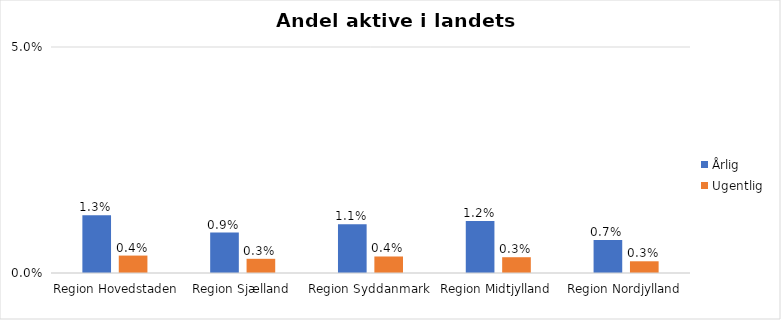
| Category | Årlig | Ugentlig |
|---|---|---|
| Region Hovedstaden | 0.013 | 0.004 |
| Region Sjælland | 0.009 | 0.003 |
| Region Syddanmark | 0.011 | 0.004 |
| Region Midtjylland | 0.012 | 0.003 |
| Region Nordjylland | 0.007 | 0.003 |